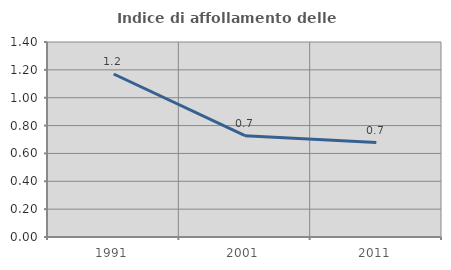
| Category | Indice di affollamento delle abitazioni  |
|---|---|
| 1991.0 | 1.17 |
| 2001.0 | 0.727 |
| 2011.0 | 0.678 |